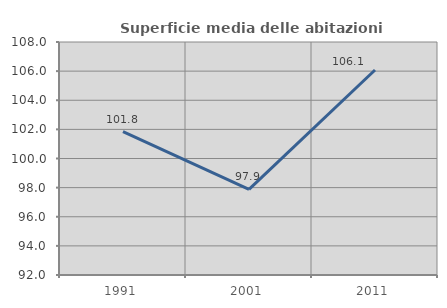
| Category | Superficie media delle abitazioni occupate |
|---|---|
| 1991.0 | 101.839 |
| 2001.0 | 97.876 |
| 2011.0 | 106.08 |